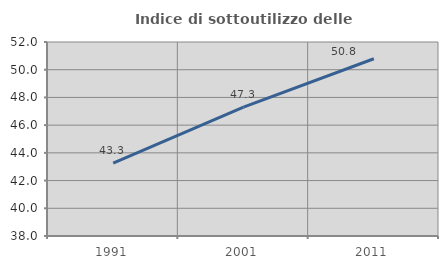
| Category | Indice di sottoutilizzo delle abitazioni  |
|---|---|
| 1991.0 | 43.255 |
| 2001.0 | 47.303 |
| 2011.0 | 50.791 |